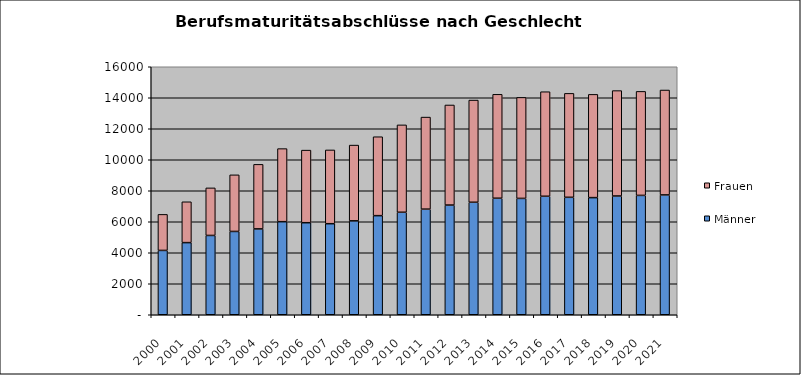
| Category | Männer | Frauen |
|---|---|---|
| 2000.0 | 4151 | 2324 |
| 2001.0 | 4654 | 2635 |
| 2002.0 | 5116 | 3069 |
| 2003.0 | 5374 | 3653 |
| 2004.0 | 5539 | 4164 |
| 2005.0 | 6005 | 4714 |
| 2006.0 | 5938 | 4683 |
| 2007.0 | 5875 | 4759 |
| 2008.0 | 6058 | 4888 |
| 2009.0 | 6394 | 5091 |
| 2010.0 | 6612 | 5637 |
| 2011.0 | 6813 | 5940 |
| 2012.0 | 7077 | 6457 |
| 2013.0 | 7258 | 6592 |
| 2014.0 | 7518 | 6704 |
| 2015.0 | 7507 | 6516 |
| 2016.0 | 7645 | 6745 |
| 2017.0 | 7577 | 6706 |
| 2018.0 | 7557 | 6661 |
| 2019.0 | 7662 | 6800 |
| 2020.0 | 7700 | 6711 |
| 2021.0 | 7731 | 6769 |